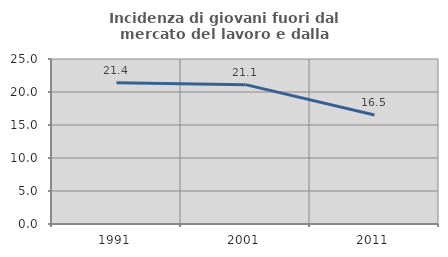
| Category | Incidenza di giovani fuori dal mercato del lavoro e dalla formazione  |
|---|---|
| 1991.0 | 21.406 |
| 2001.0 | 21.116 |
| 2011.0 | 16.518 |